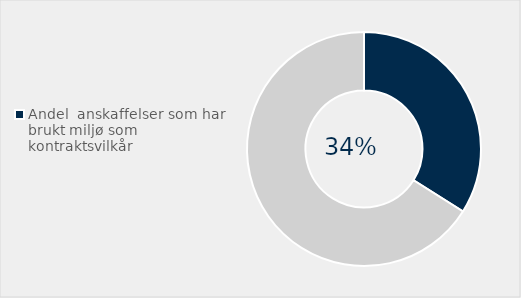
| Category | Series 0 |
|---|---|
| Andel  anskaffelser som har brukt miljø som  kontraktsvilkår | 0.34 |
| Ikke brukt miljø  som kontraktsvilkår' | 0.66 |